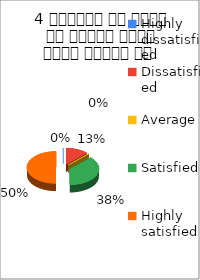
| Category | 4 शिक्षक ने विषय के प्रति रूचि रूचि जागृत की  |
|---|---|
| Highly dissatisfied | 0 |
| Dissatisfied | 1 |
| Average | 0 |
| Satisfied | 3 |
| Highly satisfied | 4 |